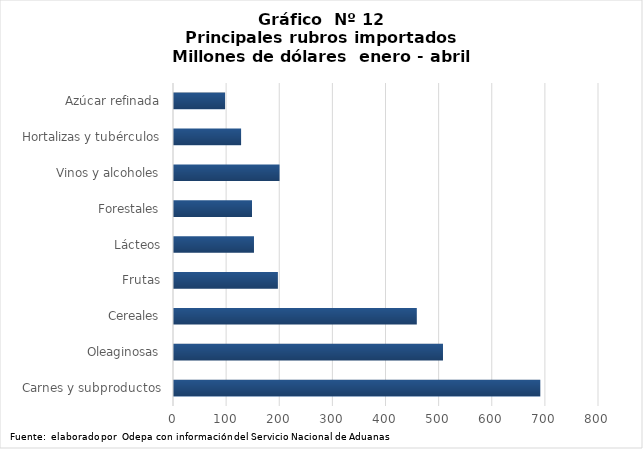
| Category | Series 0 |
|---|---|
| Carnes y subproductos | 689526.397 |
| Oleaginosas | 506323.805 |
| Cereales | 457055.301 |
| Frutas | 195544.927 |
| Lácteos | 150549.538 |
| Forestales | 146832 |
| Vinos y alcoholes | 198643.043 |
| Hortalizas y tubérculos | 126306.15 |
| Azúcar refinada | 96171.004 |